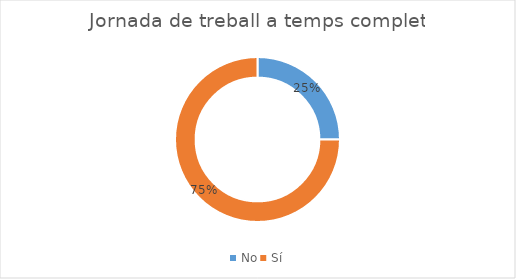
| Category | Series 0 |
|---|---|
| No | 2 |
| Sí | 6 |